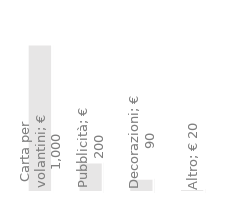
| Category | Uscite annuali |
|---|---|
| Carta per volantini | 1000 |
| Pubblicità | 200 |
| Decorazioni | 90 |
| Altro | 20 |